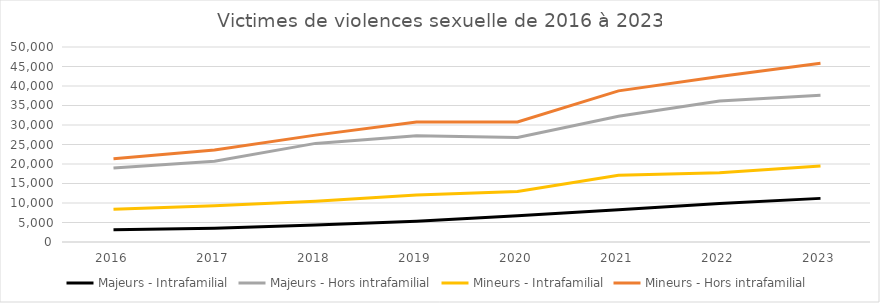
| Category | Majeurs - Intrafamilial | Majeurs - Hors intrafamilial | Mineurs - Intrafamilial | Mineurs - Hors intrafamilial |
|---|---|---|---|---|
| 2016.0 | 3148 | 19002 | 8372 | 21355 |
| 2017.0 | 3525 | 20688 | 9264 | 23571 |
| 2018.0 | 4333 | 25283 | 10465 | 27403 |
| 2019.0 | 5312 | 27225 | 12043 | 30753 |
| 2020.0 | 6702 | 26804 | 12961 | 30767 |
| 2021.0 | 8250 | 32260 | 17142 | 38747 |
| 2022.0 | 9883 | 36137 | 17731 | 42436 |
| 2023.0 | 11186 | 37650 | 19492 | 45807 |